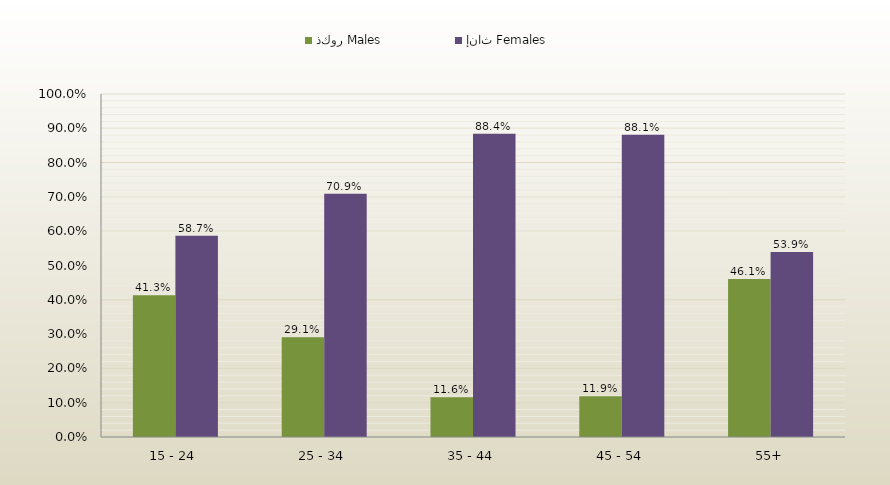
| Category | ذكور Males | إناث Females |
|---|---|---|
| 15 - 24 | 0.413 | 0.587 |
| 25 - 34 | 0.291 | 0.709 |
| 35 - 44 | 0.116 | 0.884 |
| 45 - 54 | 0.119 | 0.881 |
| 55+ | 0.461 | 0.539 |